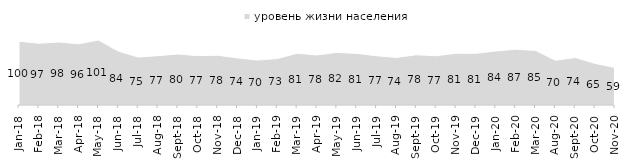
| Category | уровень жизни населения |
|---|---|
| 2018-01-01 | 99.6 |
| 2018-02-01 | 96.5 |
| 2018-03-01 | 98.45 |
| 2018-04-01 | 95.55 |
| 2018-05-01 | 101.45 |
| 2018-06-01 | 84.2 |
| 2018-07-01 | 74.9 |
| 2018-08-01 | 77.1 |
| 2018-09-01 | 79.6 |
| 2018-10-01 | 77.1 |
| 2018-11-01 | 77.745 |
| 2018-12-01 | 73.6 |
| 2019-01-01 | 70.25 |
| 2019-02-01 | 72.55 |
| 2019-03-01 | 80.806 |
| 2019-04-01 | 78.168 |
| 2019-05-01 | 82.169 |
| 2019-06-01 | 80.648 |
| 2019-07-01 | 76.881 |
| 2019-08-01 | 74.276 |
| 2019-09-01 | 78.465 |
| 2019-10-01 | 76.931 |
| 2019-11-01 | 80.842 |
| 2019-12-01 | 80.792 |
| 2020-01-01 | 84.406 |
| 2020-02-01 | 87.129 |
| 2020-03-01 | 85.275 |
| 2020-08-01 | 69.911 |
| 2020-09-01 | 74.116 |
| 2020-10-01 | 64.973 |
| 2020-11-01 | 58.55 |